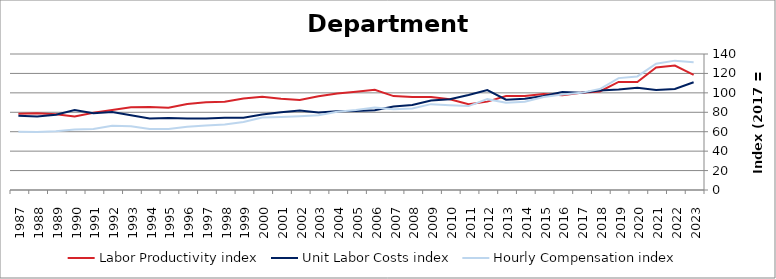
| Category | Labor Productivity index | Unit Labor Costs index | Hourly Compensation index |
|---|---|---|---|
| 2023.0 | 118.599 | 110.918 | 131.547 |
| 2022.0 | 128.15 | 103.916 | 133.168 |
| 2021.0 | 126.145 | 103.017 | 129.951 |
| 2020.0 | 111.19 | 105.133 | 116.898 |
| 2019.0 | 111.277 | 103.492 | 115.164 |
| 2018.0 | 101.402 | 102.528 | 103.965 |
| 2017.0 | 100 | 100 | 100 |
| 2016.0 | 97.455 | 100.896 | 98.328 |
| 2015.0 | 98.839 | 96.752 | 95.629 |
| 2014.0 | 96.721 | 93.946 | 90.865 |
| 2013.0 | 96.766 | 92.936 | 89.93 |
| 2012.0 | 90.979 | 102.8 | 93.526 |
| 2011.0 | 88.32 | 97.8 | 86.376 |
| 2010.0 | 93.323 | 93.449 | 87.21 |
| 2009.0 | 95.835 | 92.229 | 88.388 |
| 2008.0 | 95.843 | 87.605 | 83.963 |
| 2007.0 | 96.647 | 85.982 | 83.099 |
| 2006.0 | 103.183 | 82.181 | 84.797 |
| 2005.0 | 101.209 | 81.287 | 82.27 |
| 2004.0 | 99.365 | 80.991 | 80.477 |
| 2003.0 | 96.483 | 79.787 | 76.981 |
| 2002.0 | 92.715 | 81.803 | 75.844 |
| 2001.0 | 93.886 | 79.961 | 75.072 |
| 2000.0 | 95.929 | 77.726 | 74.562 |
| 1999.0 | 94.285 | 74.333 | 70.085 |
| 1998.0 | 90.75 | 74.41 | 67.527 |
| 1997.0 | 90.212 | 73.693 | 66.48 |
| 1996.0 | 88.613 | 73.566 | 65.189 |
| 1995.0 | 84.712 | 74.017 | 62.702 |
| 1994.0 | 85.358 | 73.669 | 62.882 |
| 1993.0 | 85.26 | 76.882 | 65.55 |
| 1992.0 | 82.413 | 80.33 | 66.202 |
| 1991.0 | 79.591 | 78.941 | 62.83 |
| 1990.0 | 75.665 | 82.265 | 62.246 |
| 1989.0 | 78.067 | 77.56 | 60.549 |
| 1988.0 | 78.938 | 75.655 | 59.721 |
| 1987.0 | 78.51 | 76.357 | 59.948 |